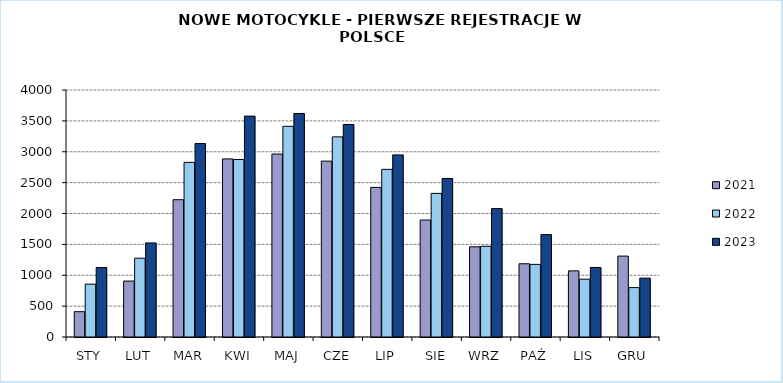
| Category | 2021 | 2022 | 2023 |
|---|---|---|---|
|  STY  | 410 | 856 | 1126 |
|  LUT  | 906 | 1276 | 1524 |
| MAR | 2223 | 2828 | 3134 |
| KWI | 2884 | 2875 | 3577 |
| MAJ | 2963 | 3412 | 3620 |
| CZE | 2848 | 3241 | 3442 |
| LIP | 2423 | 2715 | 2949 |
| SIE | 1894 | 2326 | 2567 |
| WRZ | 1461 | 1469 | 2080 |
| PAŹ | 1186 | 1176 | 1658 |
| LIS | 1071 | 936 | 1126 |
| GRU | 1310 | 800 | 953 |